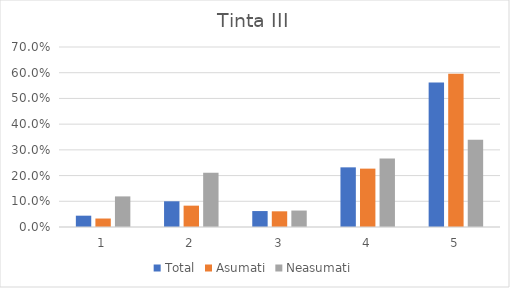
| Category | Total | Asumati | Neasumati |
|---|---|---|---|
| 0 | 0.044 | 0.033 | 0.119 |
| 1 | 0.1 | 0.083 | 0.211 |
| 2 | 0.062 | 0.061 | 0.064 |
| 3 | 0.232 | 0.227 | 0.266 |
| 4 | 0.562 | 0.596 | 0.339 |